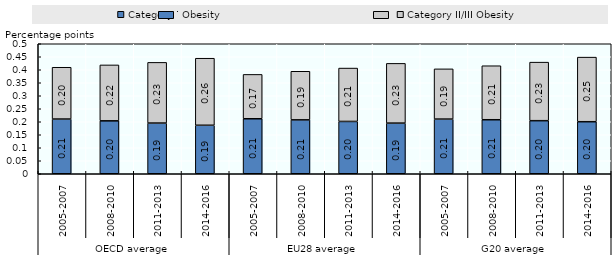
| Category | Category I Obesity | Category II/III Obesity |
|---|---|---|
| 0 | 0.21 | 0.199 |
| 1 | 0.204 | 0.215 |
| 2 | 0.195 | 0.233 |
| 3 | 0.187 | 0.258 |
| 4 | 0.211 | 0.171 |
| 5 | 0.207 | 0.187 |
| 6 | 0.201 | 0.205 |
| 7 | 0.195 | 0.23 |
| 8 | 0.21 | 0.193 |
| 9 | 0.208 | 0.208 |
| 10 | 0.204 | 0.225 |
| 11 | 0.2 | 0.248 |